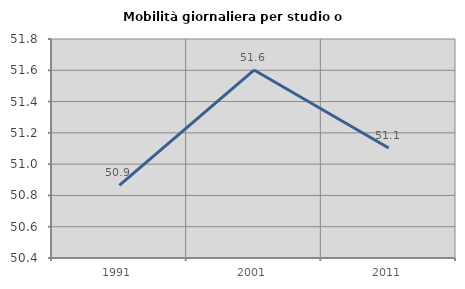
| Category | Mobilità giornaliera per studio o lavoro |
|---|---|
| 1991.0 | 50.865 |
| 2001.0 | 51.601 |
| 2011.0 | 51.104 |